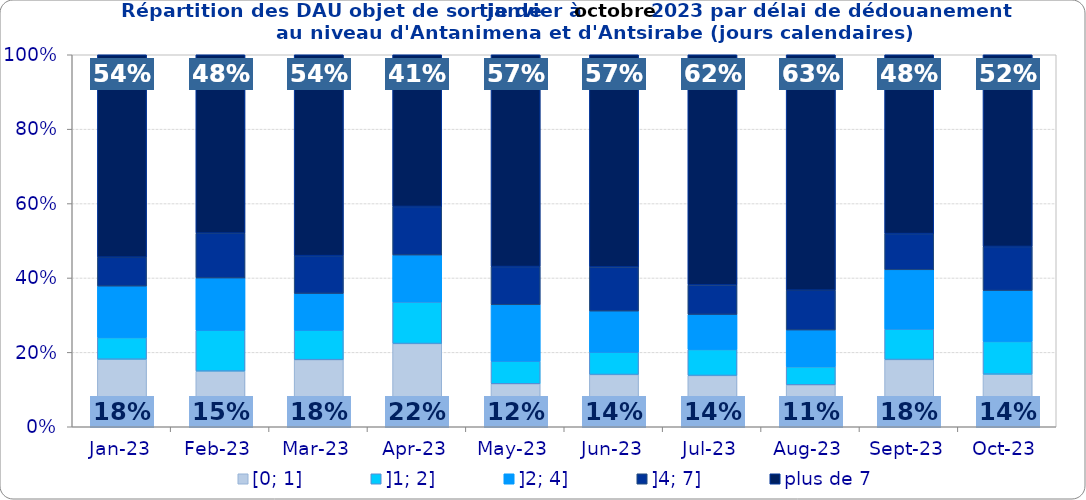
| Category | [0; 1] | ]1; 2] | ]2; 4] | ]4; 7] | plus de 7 |
|---|---|---|---|---|---|
| 2023-01-01 | 0.182 | 0.058 | 0.138 | 0.078 | 0.544 |
| 2023-02-01 | 0.15 | 0.11 | 0.141 | 0.121 | 0.479 |
| 2023-03-01 | 0.18 | 0.079 | 0.099 | 0.102 | 0.54 |
| 2023-04-01 | 0.224 | 0.112 | 0.126 | 0.13 | 0.408 |
| 2023-05-01 | 0.116 | 0.061 | 0.152 | 0.103 | 0.569 |
| 2023-06-01 | 0.14 | 0.06 | 0.111 | 0.119 | 0.57 |
| 2023-07-01 | 0.138 | 0.07 | 0.094 | 0.079 | 0.619 |
| 2023-08-01 | 0.113 | 0.049 | 0.099 | 0.107 | 0.633 |
| 2023-09-01 | 0.181 | 0.082 | 0.159 | 0.097 | 0.481 |
| 2023-10-01 | 0.141 | 0.088 | 0.137 | 0.118 | 0.515 |